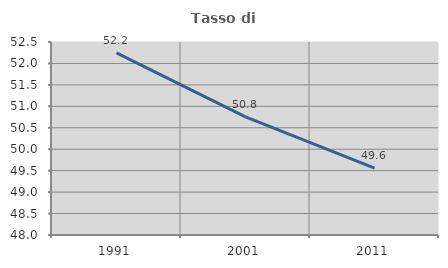
| Category | Tasso di occupazione   |
|---|---|
| 1991.0 | 52.246 |
| 2001.0 | 50.753 |
| 2011.0 | 49.559 |